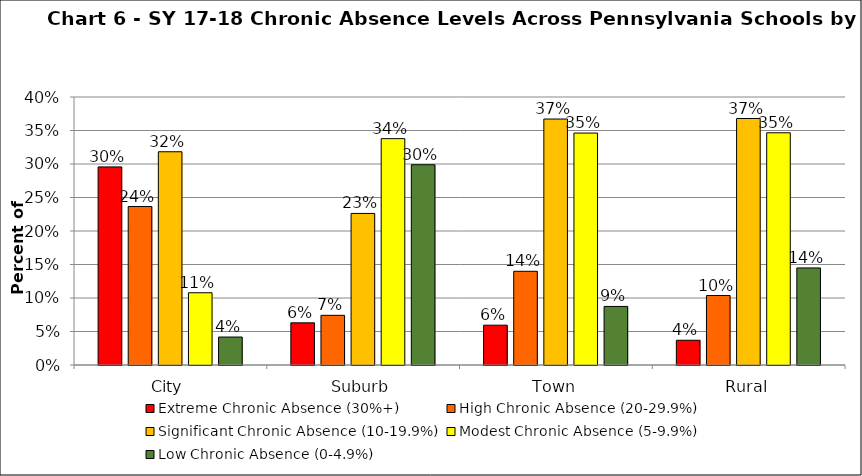
| Category | Extreme Chronic Absence (30%+) | High Chronic Absence (20-29.9%) | Significant Chronic Absence (10-19.9%) | Modest Chronic Absence (5-9.9%) | Low Chronic Absence (0-4.9%) |
|---|---|---|---|---|---|
| 0 | 0.296 | 0.237 | 0.318 | 0.108 | 0.042 |
| 1 | 0.063 | 0.074 | 0.226 | 0.338 | 0.299 |
| 2 | 0.059 | 0.14 | 0.367 | 0.346 | 0.087 |
| 3 | 0.037 | 0.104 | 0.368 | 0.347 | 0.145 |